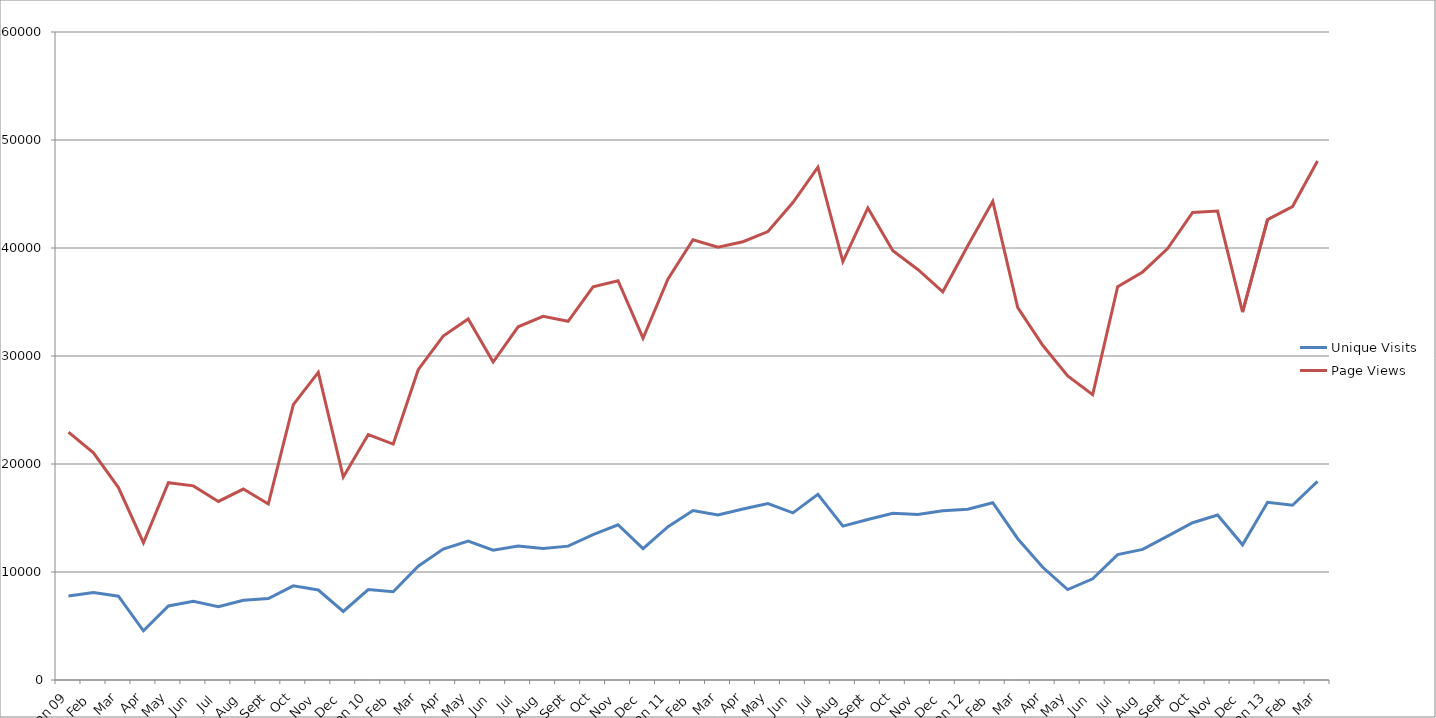
| Category | Unique Visits | Page Views |
|---|---|---|
| Jan 09 | 7787 | 22955 |
| Feb | 8106 | 21038 |
| Mar | 7759 | 17818 |
| Apr | 4558 | 12710 |
| May | 6856 | 18264 |
| Jun | 7287 | 17976 |
| Jul | 6794 | 16534 |
| Aug | 7390 | 17678 |
| Sept | 7544 | 16302 |
| Oct | 8718 | 25498 |
| Nov | 8334 | 28477 |
| Dec | 6350 | 18791 |
| Jan 10 | 8378 | 22722 |
| Feb | 8168 | 21846 |
| Mar | 10542 | 28729 |
| Apr | 12122 | 31853 |
| May | 12870 | 33425 |
| Jun | 12016 | 29439 |
| Jul | 12411 | 32703 |
| Aug | 12170 | 33672 |
| Sept | 12393 | 33210 |
| Oct | 13467 | 36409 |
| Nov | 14375 | 36973 |
| Dec | 12167 | 31647 |
| Jan 11 | 14201 | 37131 |
| Feb | 15687 | 40765 |
| Mar | 15273 | 40073 |
| Apr | 15826 | 40581 |
| May | 16337 | 41526 |
| Jun | 15472 | 44207 |
| Jul | 17202 | 47484 |
| Aug | 14249 | 38738 |
| Sept | 14863 | 43714 |
| Oct | 15436 | 39744 |
| Nov | 15315 | 38015 |
| Dec | 15661 | 35946 |
| Jan 12 | 15815 | 40200 |
| Feb | 16411 | 44321 |
| Mar | 13083 | 34483 |
| Apr | 10438 | 30994 |
| May | 8378 | 28154 |
| Jun | 9369 | 26421 |
| Jul | 11615 | 36415 |
| Aug | 12097 | 37785 |
| Sept | 13317 | 39951 |
| Oct | 14565 | 43287 |
| Nov | 15269 | 43421 |
| Dec | 12517 | 34055 |
| Jan 13 | 16449 | 42633 |
| Feb | 16180 | 43838 |
| Mar | 18386 | 48049 |